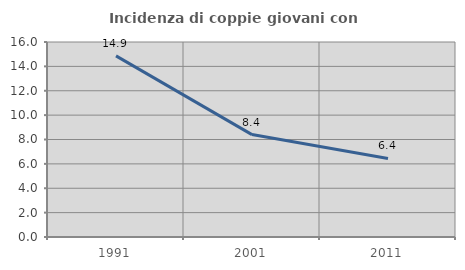
| Category | Incidenza di coppie giovani con figli |
|---|---|
| 1991.0 | 14.864 |
| 2001.0 | 8.404 |
| 2011.0 | 6.448 |